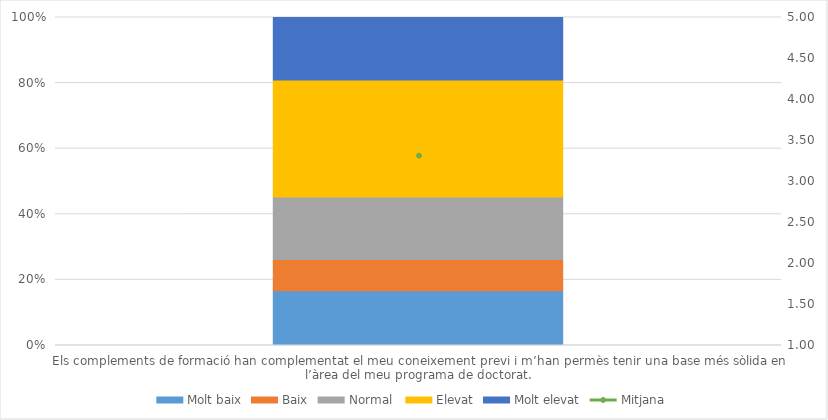
| Category | Molt baix | Baix | Normal  | Elevat | Molt elevat |
|---|---|---|---|---|---|
| Els complements de formació han complementat el meu coneixement previ i m’han permès tenir una base més sòlida en l’àrea del meu programa de doctorat. | 7 | 4 | 8 | 15 | 8 |